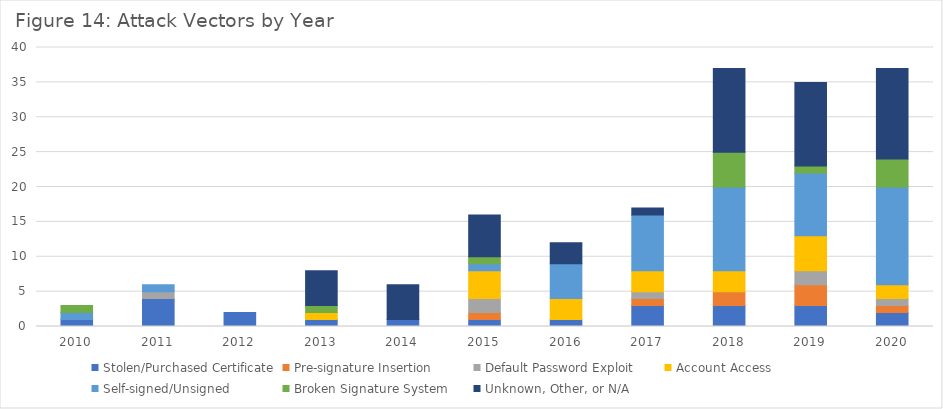
| Category | Stolen/Purchased Certificate | Pre-signature Insertion | Default Password Exploit | Account Access | Self-signed/Unsigned | Broken Signature System | Unknown, Other, or N/A |
|---|---|---|---|---|---|---|---|
| 2010.0 | 1 | 0 | 0 | 0 | 1 | 1 | 0 |
| 2011.0 | 4 | 0 | 1 | 0 | 1 | 0 | 0 |
| 2012.0 | 2 | 0 | 0 | 0 | 0 | 0 | 0 |
| 2013.0 | 1 | 0 | 0 | 1 | 0 | 1 | 5 |
| 2014.0 | 1 | 0 | 0 | 0 | 0 | 0 | 5 |
| 2015.0 | 1 | 1 | 2 | 4 | 1 | 1 | 6 |
| 2016.0 | 1 | 0 | 0 | 3 | 5 | 0 | 3 |
| 2017.0 | 3 | 1 | 1 | 3 | 8 | 0 | 1 |
| 2018.0 | 3 | 2 | 0 | 3 | 12 | 5 | 12 |
| 2019.0 | 3 | 3 | 2 | 5 | 9 | 1 | 12 |
| 2020.0 | 2 | 1 | 1 | 2 | 14 | 4 | 13 |